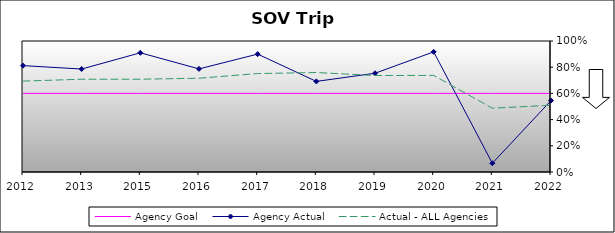
| Category | Agency Goal | Agency Actual | Actual - ALL Agencies |
|---|---|---|---|
| 2012.0 | 0.6 | 0.812 | 0.694 |
| 2013.0 | 0.6 | 0.786 | 0.708 |
| 2015.0 | 0.6 | 0.91 | 0.708 |
| 2016.0 | 0.6 | 0.787 | 0.716 |
| 2017.0 | 0.6 | 0.9 | 0.752 |
| 2018.0 | 0.6 | 0.692 | 0.759 |
| 2019.0 | 0.6 | 0.754 | 0.736 |
| 2020.0 | 0.6 | 0.917 | 0.737 |
| 2021.0 | 0.6 | 0.067 | 0.487 |
| 2022.0 | 0.6 | 0.545 | 0.509 |